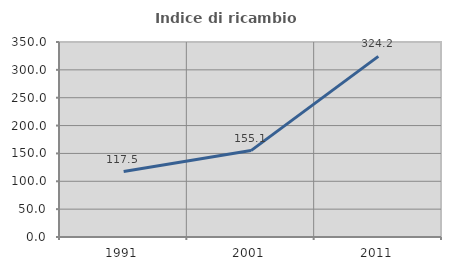
| Category | Indice di ricambio occupazionale  |
|---|---|
| 1991.0 | 117.529 |
| 2001.0 | 155.109 |
| 2011.0 | 324.185 |